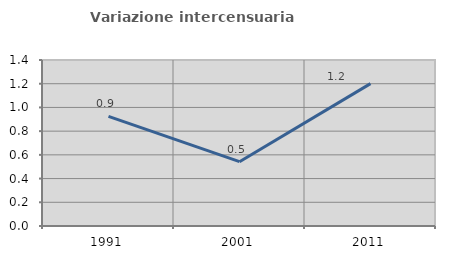
| Category | Variazione intercensuaria annua |
|---|---|
| 1991.0 | 0.925 |
| 2001.0 | 0.542 |
| 2011.0 | 1.201 |